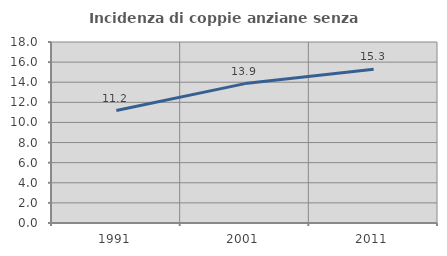
| Category | Incidenza di coppie anziane senza figli  |
|---|---|
| 1991.0 | 11.184 |
| 2001.0 | 13.863 |
| 2011.0 | 15.282 |